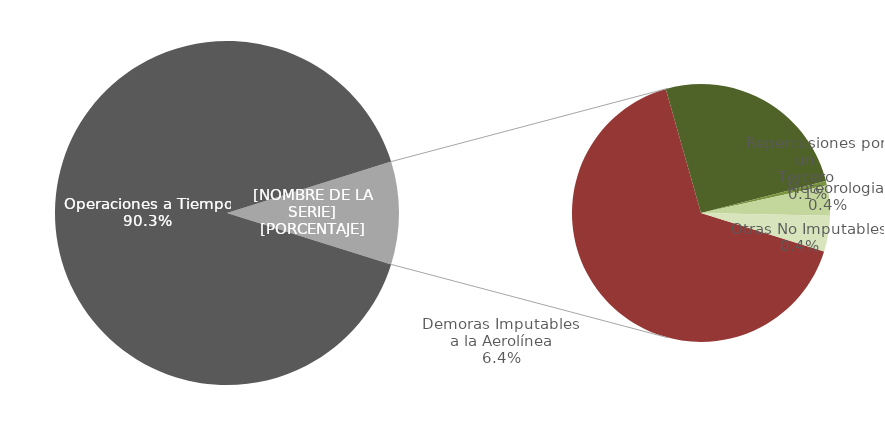
| Category | Demoras |
|---|---|
| Operaciones a Tiempo | 5191 |
| Demoras Imputables 
a la Aerolínea | 365 |
|    Aplicación de Control 
de Flujo | 141 |
|    Repercusiones por un 
Tercero | 3 |
|    Meteorologia | 21 |
|    Otras No Imputables | 25 |